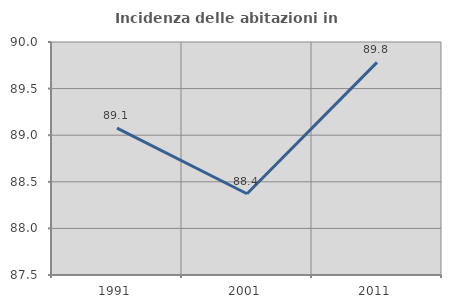
| Category | Incidenza delle abitazioni in proprietà  |
|---|---|
| 1991.0 | 89.076 |
| 2001.0 | 88.372 |
| 2011.0 | 89.781 |